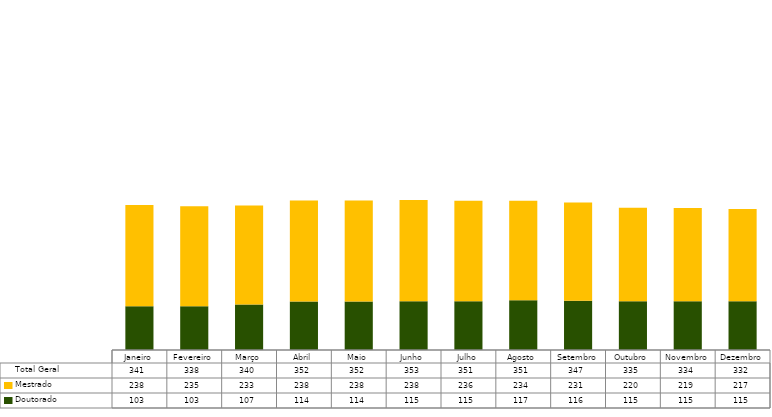
| Category | Doutorado                      | Mestrado                       | Total Geral |
|---|---|---|---|
| Janeiro | 103 | 238 | 341 |
| Fevereiro | 103 | 235 | 338 |
| Março | 107 | 233 | 340 |
| Abril | 114 | 238 | 352 |
| Maio | 114 | 238 | 352 |
| Junho | 115 | 238 | 353 |
| Julho | 115 | 236 | 351 |
| Agosto | 117 | 234 | 351 |
| Setembro | 116 | 231 | 347 |
| Outubro | 115 | 220 | 335 |
| Novembro | 115 | 219 | 334 |
| Dezembro | 115 | 217 | 332 |